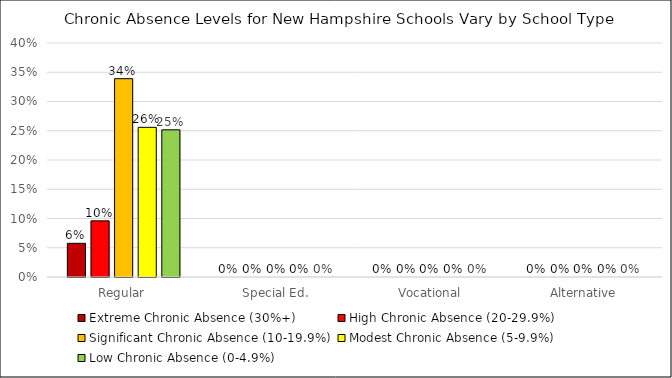
| Category | Extreme Chronic Absence (30%+) | High Chronic Absence (20-29.9%) | Significant Chronic Absence (10-19.9%) | Modest Chronic Absence (5-9.9%) | Low Chronic Absence (0-4.9%) |
|---|---|---|---|---|---|
| Regular | 0.058 | 0.096 | 0.339 | 0.256 | 0.252 |
| Special Ed. | 0 | 0 | 0 | 0 | 0 |
| Vocational | 0 | 0 | 0 | 0 | 0 |
| Alternative | 0 | 0 | 0 | 0 | 0 |